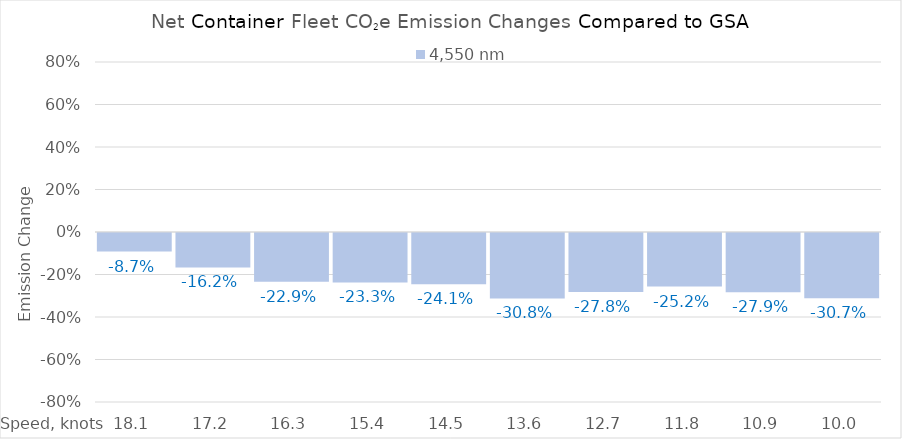
| Category | 4,550 |
|---|---|
| 18.1 | -0.087 |
| 17.200000000000003 | -0.162 |
| 16.300000000000004 | -0.229 |
| 15.400000000000004 | -0.233 |
| 14.500000000000004 | -0.241 |
| 13.600000000000003 | -0.308 |
| 12.700000000000003 | -0.278 |
| 11.800000000000002 | -0.252 |
| 10.900000000000002 | -0.279 |
| 10.000000000000002 | -0.307 |